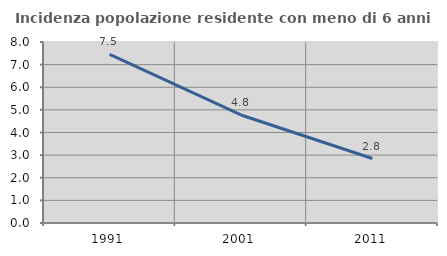
| Category | Incidenza popolazione residente con meno di 6 anni |
|---|---|
| 1991.0 | 7.453 |
| 2001.0 | 4.774 |
| 2011.0 | 2.849 |